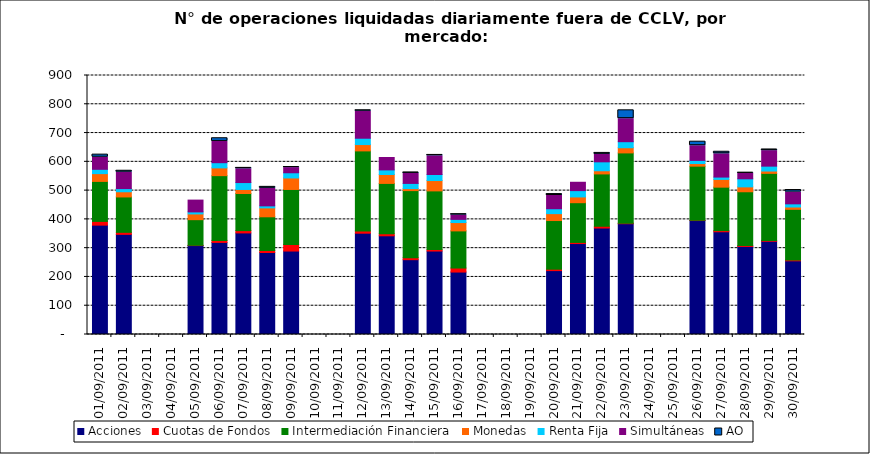
| Category | Acciones | Cuotas de Fondos | Intermediación Financiera | Monedas | Renta Fija | Simultáneas | AO |
|---|---|---|---|---|---|---|---|
| 01/09/2011 | 380 | 13 | 139 | 27 | 15 | 42 | 9 |
| 02/09/2011 | 348 | 7 | 123 | 18 | 11 | 57 | 5 |
| 05/09/2011 | 309 | 1 | 89 | 20 | 7 | 41 | 0 |
| 06/09/2011 | 320 | 7 | 225 | 27 | 18 | 74 | 11 |
| 07/09/2011 | 353 | 8 | 129 | 14 | 24 | 48 | 3 |
| 08/09/2011 | 285 | 7 | 117 | 31 | 7 | 61 | 5 |
| 09/09/2011 | 290 | 23 | 191 | 40 | 18 | 18 | 2 |
| 12/09/2011 | 352 | 8 | 278 | 22 | 22 | 94 | 3 |
| 13/09/2011 | 343 | 7 | 175 | 31 | 16 | 43 | 0 |
| 14/09/2011 | 260 | 7 | 233 | 7 | 18 | 35 | 3 |
| 15/09/2011 | 290 | 5 | 204 | 36 | 21 | 65 | 3 |
| 16/09/2011 | 217 | 14 | 129 | 29 | 11 | 15 | 3 |
| 20/09/2011 | 222 | 5 | 169 | 24 | 17 | 46 | 5 |
| 21/09/2011 | 316 | 4 | 138 | 20 | 22 | 29 | 0 |
| 22/09/2011 | 370 | 6 | 182 | 11 | 31 | 26 | 5 |
| 23/09/2011 | 385 | 2 | 244 | 18 | 21 | 80 | 29 |
| 26/09/2011 | 396 | 1 | 188 | 9 | 11 | 51 | 14 |
| 27/09/2011 | 357 | 4 | 151 | 27 | 8 | 81 | 7 |
| 28/09/2011 | 306 | 3 | 187 | 17 | 28 | 19 | 2 |
| 29/09/2011 | 324 | 3 | 233 | 8 | 17 | 54 | 4 |
| 30/09/2011 | 256 | 3 | 176 | 8 | 11 | 41 | 7 |